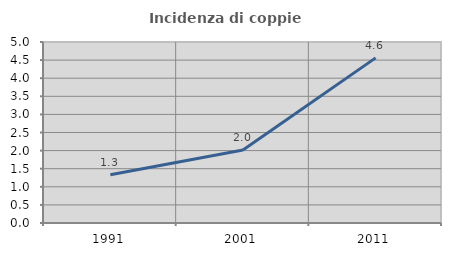
| Category | Incidenza di coppie miste |
|---|---|
| 1991.0 | 1.331 |
| 2001.0 | 2.017 |
| 2011.0 | 4.561 |